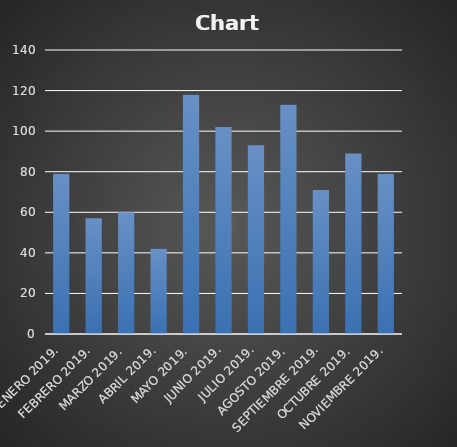
| Category | Series 0 |
|---|---|
| ENERO 2019. | 79 |
| FEBRERO 2019. | 57 |
| MARZO 2019. | 60 |
| ABRIL 2019. | 42 |
| MAYO 2019. | 118 |
| JUNIO 2019. | 102 |
| JULIO 2019. | 93 |
| AGOSTO 2019. | 113 |
| SEPTIEMBRE 2019. | 71 |
| OCTUBRE 2019. | 89 |
| NOVIEMBRE 2019. | 79 |